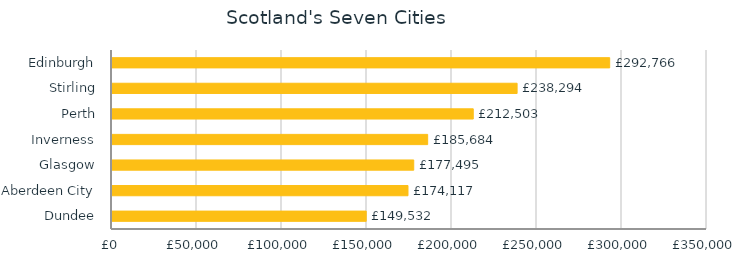
| Category | Series 0 |
|---|---|
| Dundee | 149532.133 |
| Aberdeen City | 174117.449 |
| Glasgow | 177495.41 |
| Inverness | 185683.584 |
| Perth | 212502.648 |
| Stirling | 238294.287 |
| Edinburgh | 292765.531 |